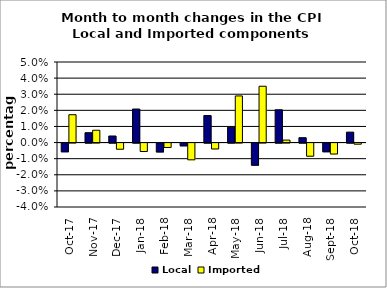
| Category | Local | Imported |
|---|---|---|
| 2017-10-01 | -0.005 | 0.017 |
| 2017-11-01 | 0.006 | 0.008 |
| 2017-12-01 | 0.004 | -0.004 |
| 2018-01-01 | 0.021 | -0.005 |
| 2018-02-01 | -0.006 | -0.003 |
| 2018-03-01 | -0.002 | -0.01 |
| 2018-04-01 | 0.017 | -0.004 |
| 2018-05-01 | 0.01 | 0.029 |
| 2018-06-01 | -0.014 | 0.035 |
| 2018-07-01 | 0.02 | 0.002 |
| 2018-08-01 | 0.003 | -0.008 |
| 2018-09-01 | -0.005 | -0.007 |
| 2018-10-01 | 0.006 | -0.001 |